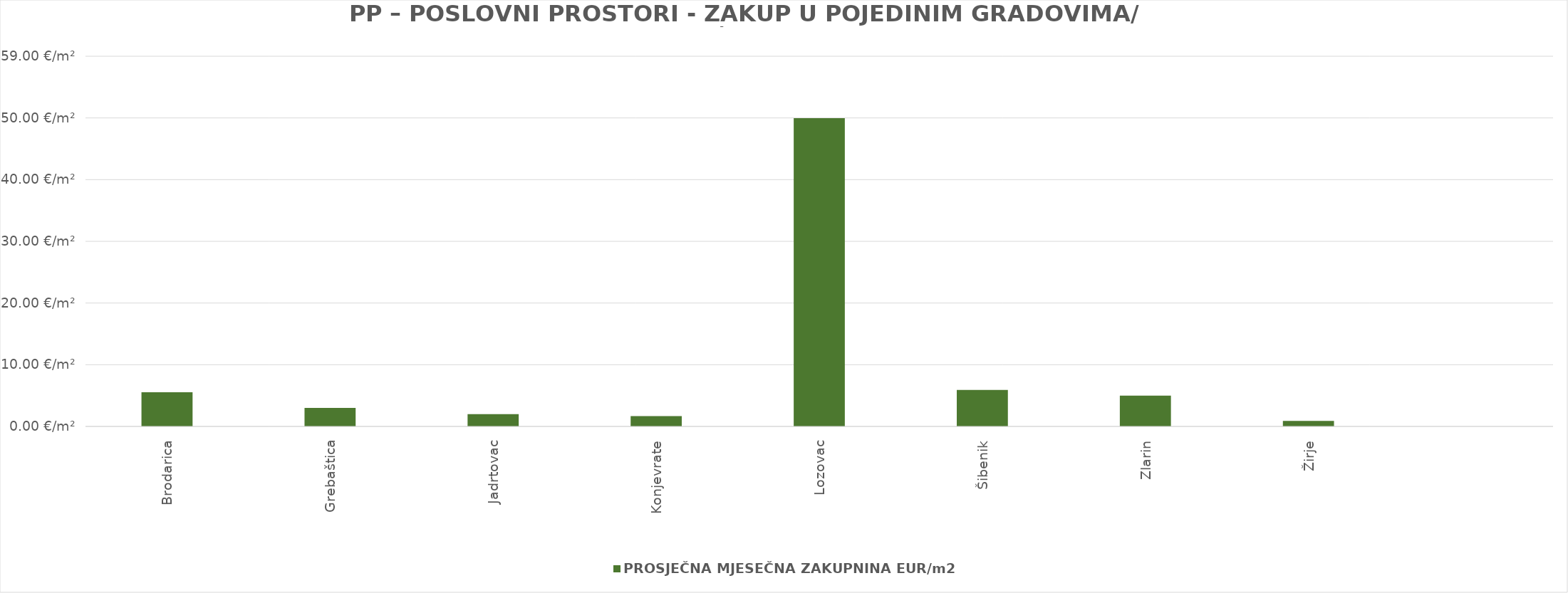
| Category | PROSJEČNA MJESEČNA ZAKUPNINA EUR/m2 |
|---|---|
| Brodarica | 1900-01-05 12:56:29 |
| Grebaštica | 1900-01-02 23:56:53 |
| Jadrtovac | 1900-01-01 23:46:48 |
| Konjevrate | 1900-01-01 15:49:00 |
| Lozovac | 1900-02-18 23:08:03 |
| Šibenik | 1900-01-05 22:01:46 |
| Zlarin | 1900-01-04 23:27:01 |
| Žirje | 0.885 |